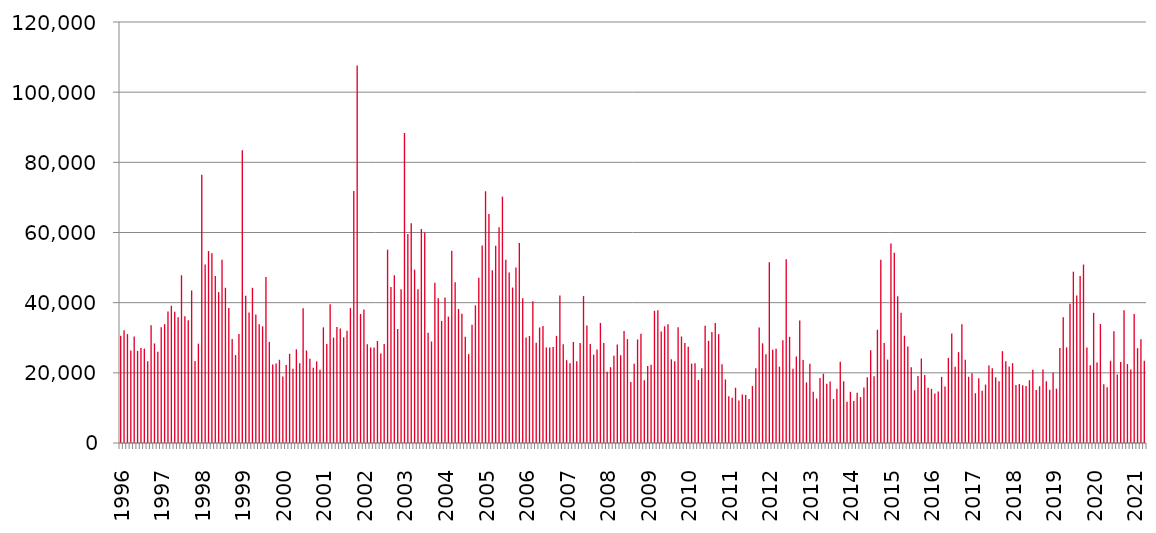
| Category | Series 0 |
|---|---|
| 1996.0 | 30565 |
| nan | 32123 |
| nan | 31044 |
| nan | 26401 |
| nan | 30370 |
| nan | 26254 |
| nan | 27073 |
| nan | 26911 |
| nan | 23273 |
| nan | 33595 |
| nan | 28374 |
| nan | 26036 |
| 1997.0 | 32963 |
| nan | 33890 |
| nan | 37509 |
| nan | 39128 |
| nan | 37399 |
| nan | 35850 |
| nan | 47806 |
| nan | 36117 |
| nan | 35023 |
| nan | 43488 |
| nan | 23397 |
| nan | 28305 |
| 1998.0 | 76429 |
| nan | 50851 |
| nan | 54713 |
| nan | 54112 |
| nan | 47617 |
| nan | 43007 |
| nan | 52250 |
| nan | 44252 |
| nan | 38498 |
| nan | 29638 |
| nan | 25062 |
| nan | 31098 |
| 1999.0 | 83423 |
| nan | 41965 |
| nan | 37191 |
| nan | 44236 |
| nan | 36632 |
| nan | 33845 |
| nan | 33248 |
| nan | 47294 |
| nan | 28815 |
| nan | 22406 |
| nan | 22665 |
| nan | 23726 |
| 2000.0 | 18950 |
| nan | 22265 |
| nan | 25419 |
| nan | 21159 |
| nan | 26713 |
| nan | 22736 |
| nan | 38395 |
| nan | 26379 |
| nan | 24035 |
| nan | 21466 |
| nan | 23271 |
| nan | 20879 |
| 2001.0 | 32965 |
| nan | 28222 |
| nan | 39557 |
| nan | 30046 |
| nan | 33063 |
| nan | 32645 |
| nan | 30113 |
| nan | 31974 |
| nan | 38459 |
| nan | 71817 |
| nan | 107589 |
| nan | 36768 |
| 2002.0 | 38060 |
| nan | 28131 |
| nan | 27242 |
| nan | 27255 |
| nan | 29074 |
| nan | 25539 |
| nan | 28215 |
| nan | 55117 |
| nan | 44435 |
| nan | 47808 |
| nan | 32529 |
| nan | 43837 |
| 2003.0 | 88327 |
| nan | 59597 |
| nan | 62620 |
| nan | 49416 |
| nan | 43798 |
| nan | 61007 |
| nan | 60030 |
| nan | 31400 |
| nan | 28943 |
| nan | 45683 |
| nan | 41241 |
| nan | 34803 |
| 2004.0 | 41446 |
| nan | 36034 |
| nan | 54779 |
| nan | 45804 |
| nan | 38217 |
| nan | 36816 |
| nan | 30279 |
| nan | 25336 |
| nan | 33712 |
| nan | 39233 |
| nan | 47110 |
| nan | 56266 |
| 2005.0 | 71750 |
| nan | 65255 |
| nan | 49275 |
| nan | 56256 |
| nan | 61526 |
| nan | 70220 |
| nan | 52226 |
| nan | 48610 |
| nan | 44307 |
| nan | 49999 |
| nan | 57010 |
| nan | 41262 |
| 2006.0 | 30057 |
| nan | 30492 |
| nan | 40434 |
| nan | 28545 |
| nan | 32934 |
| nan | 33331 |
| nan | 27232 |
| nan | 27227 |
| nan | 27362 |
| nan | 30541 |
| nan | 42045 |
| nan | 28139 |
| 2007.0 | 23612 |
| nan | 22747 |
| nan | 28800 |
| nan | 23287 |
| nan | 28534 |
| nan | 41888 |
| nan | 33468 |
| nan | 28249 |
| nan | 25173 |
| nan | 26672 |
| nan | 34222 |
| nan | 28477 |
| 2008.0 | 20317 |
| nan | 21603 |
| nan | 24900 |
| nan | 28044 |
| nan | 25045 |
| nan | 31958 |
| nan | 29617 |
| nan | 17400 |
| nan | 22606 |
| nan | 29515 |
| nan | 31141 |
| nan | 17871 |
| 2009.0 | 21922 |
| nan | 22273 |
| nan | 37691 |
| nan | 37814 |
| nan | 31759 |
| nan | 33266 |
| nan | 33847 |
| nan | 23861 |
| nan | 23337 |
| nan | 33006 |
| nan | 30362 |
| nan | 28492 |
| 2010.0 | 27450 |
| nan | 22616 |
| nan | 22731 |
| nan | 17976 |
| nan | 21322 |
| nan | 33400 |
| nan | 29135 |
| nan | 31611 |
| nan | 34182 |
| nan | 31026 |
| nan | 22439 |
| nan | 18115 |
| 2011.0 | 13316 |
| nan | 12864 |
| nan | 15754 |
| nan | 12139 |
| nan | 13789 |
| nan | 13734 |
| nan | 12532 |
| nan | 16226 |
| nan | 21335 |
| nan | 32945 |
| nan | 28411 |
| nan | 25267 |
| 2012.0 | 51510 |
| nan | 26596 |
| nan | 26832 |
| nan | 21765 |
| nan | 29303 |
| nan | 52347 |
| nan | 30268 |
| nan | 21147 |
| nan | 24668 |
| nan | 34903 |
| nan | 23658 |
| nan | 17274 |
| 2013.0 | 22563 |
| nan | 14625 |
| nan | 12699 |
| nan | 18561 |
| nan | 19723 |
| nan | 16907 |
| nan | 17520 |
| nan | 12540 |
| nan | 15437 |
| nan | 23184 |
| nan | 17588 |
| nan | 11776 |
| 2014.0 | 14586 |
| nan | 11955 |
| nan | 14313 |
| nan | 13092 |
| nan | 15802 |
| nan | 18723 |
| nan | 26437 |
| nan | 19044 |
| nan | 32284 |
| nan | 52247 |
| nan | 28493 |
| nan | 23777 |
| 2015.0 | 56844 |
| nan | 54236 |
| nan | 41842 |
| nan | 37095 |
| nan | 30576 |
| nan | 27477 |
| nan | 21618 |
| nan | 15038 |
| nan | 19111 |
| nan | 24093 |
| nan | 19410 |
| nan | 15763 |
| 2016.0 | 15437 |
| nan | 14139 |
| nan | 14651 |
| nan | 18849 |
| nan | 16093 |
| nan | 24250 |
| nan | 31240 |
| nan | 21702 |
| nan | 25896 |
| nan | 33869 |
| nan | 23745 |
| nan | 18884 |
| 2017.0 | 19855 |
| nan | 14198 |
| nan | 18466 |
| nan | 14903 |
| nan | 16658 |
| nan | 22085 |
| nan | 21288 |
| nan | 18723 |
| nan | 17630 |
| nan | 26163 |
| nan | 23289 |
| nan | 21791 |
| 2018.0 | 22760 |
| nan | 16515 |
| nan | 16828 |
| nan | 16495 |
| nan | 16238 |
| nan | 17890 |
| nan | 20891 |
| nan | 15083 |
| nan | 16174 |
| nan | 20928 |
| nan | 17597 |
| nan | 15201 |
| 2019.0 | 20124 |
| nan | 15478 |
| nan | 27086 |
| nan | 35849 |
| nan | 27253 |
| nan | 39668 |
| nan | 48828 |
| nan | 42071 |
| nan | 47584 |
| nan | 50870 |
| nan | 27234 |
| nan | 22192 |
| 2020.0 | 37109 |
| nan | 22975 |
| nan | 33939 |
| nan | 16770 |
| nan | 15910 |
| nan | 23457 |
| nan | 31858 |
| nan | 19528 |
| nan | 23104 |
| nan | 37808 |
| nan | 22500 |
| nan | 20922 |
| 2021.0 | 36789 |
| nan | 27027 |
| nan | 29561 |
| nan | 23439 |